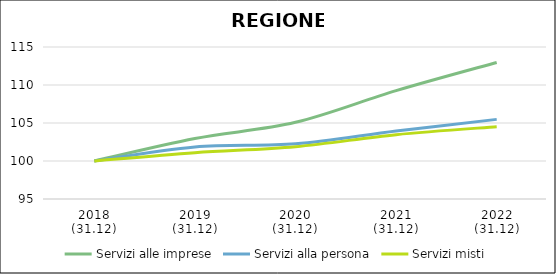
| Category | Servizi alle imprese | Servizi alla persona | Servizi misti |
|---|---|---|---|
| 2018
(31.12) | 100 | 100 | 100 |
| 2019
(31.12) | 102.962 | 101.851 | 101.095 |
| 2020
(31.12) | 105.088 | 102.256 | 101.88 |
| 2021
(31.12) | 109.252 | 103.938 | 103.469 |
| 2022
(31.12) | 112.962 | 105.478 | 104.512 |